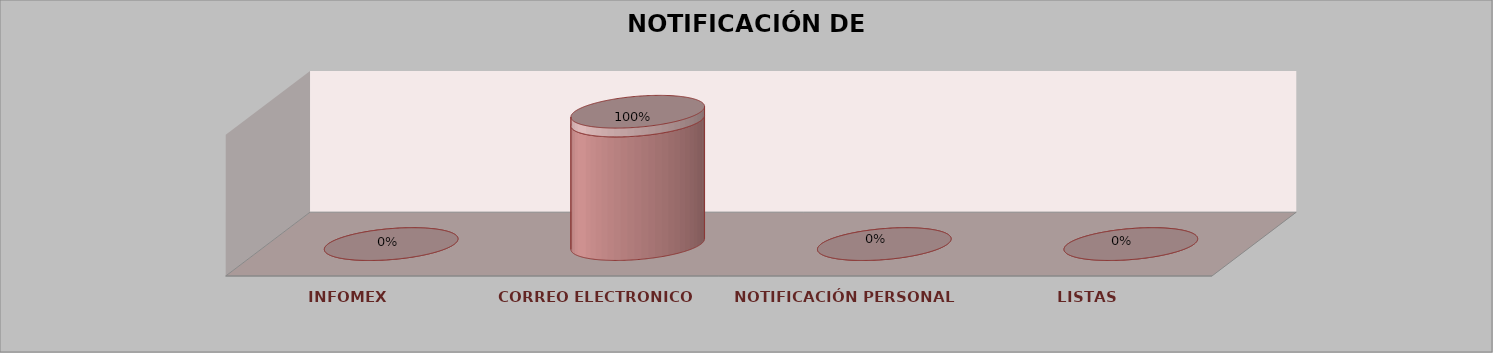
| Category | Series 0 | Series 1 | Series 2 | Series 3 | Series 4 |
|---|---|---|---|---|---|
| INFOMEX |  |  |  | 0 | 0 |
| CORREO ELECTRONICO |  |  |  | 14 | 1 |
| NOTIFICACIÓN PERSONAL |  |  |  | 0 | 0 |
| LISTAS |  |  |  | 0 | 0 |